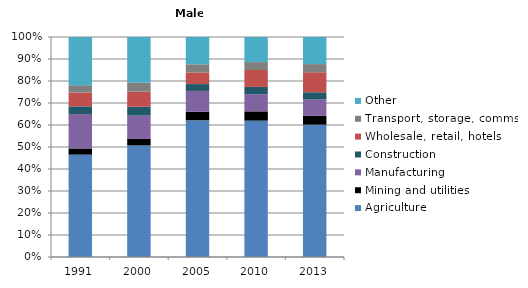
| Category | Agriculture | Mining and utilities | Manufacturing | Construction | Wholesale, retail, hotels | Transport, storage, comms | Other |
|---|---|---|---|---|---|---|---|
| 1991.0 | 46.5 | 2.8 | 15.6 | 3.5 | 6.3 | 3.3 | 21.9 |
| 2000.0 | 50.7 | 2.9 | 10.6 | 4 | 6.9 | 4 | 20.8 |
| 2005.0 | 62.1 | 3.9 | 9.5 | 3.1 | 5.3 | 3.7 | 12.4 |
| 2010.0 | 62 | 4.2 | 7.8 | 3.3 | 7.7 | 3.6 | 11.4 |
| 2013.0 | 60.1 | 4 | 7.4 | 3.3 | 9.1 | 3.7 | 12.3 |